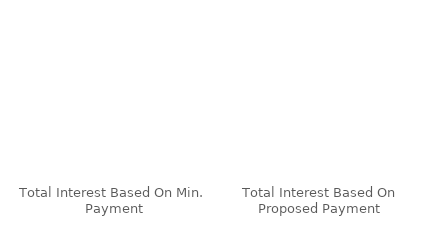
| Category | Series 0 |
|---|---|
| Total Interest Based On Min. Payment | 0 |
| Total Interest Based On Proposed Payment | 0 |